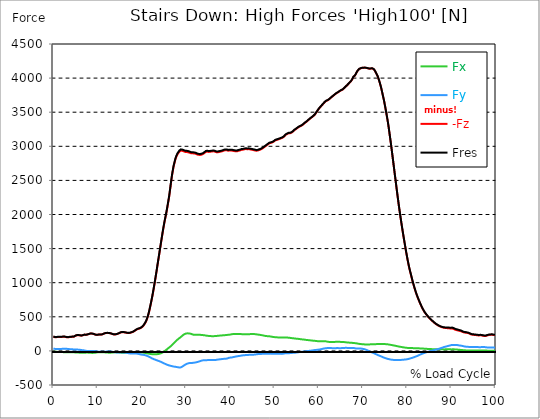
| Category |  Fx |  Fy |  -Fz |  Fres |
|---|---|---|---|---|
| 0.0 | -12.332 | 30.818 | 209.785 | 212.545 |
| 0.167348456675344 | -12.777 | 31.087 | 205.289 | 208.156 |
| 0.334696913350688 | -12.817 | 29.929 | 200.738 | 203.498 |
| 0.5020453700260321 | -12.723 | 28.004 | 198.544 | 201.075 |
| 0.669393826701376 | -13.45 | 27.654 | 201.411 | 203.929 |
| 0.83674228337672 | -14.083 | 27.627 | 203.256 | 205.8 |
| 1.0040907400520642 | -14.567 | 28.084 | 203.687 | 206.312 |
| 1.1621420602454444 | -15.092 | 28.636 | 203.915 | 206.635 |
| 1.3294905169207885 | -15.564 | 29.054 | 203.767 | 206.554 |
| 1.4968389735961325 | -15.981 | 29.296 | 203.444 | 206.285 |
| 1.6641874302714765 | -16.318 | 29.242 | 203.579 | 206.393 |
| 1.8315358869468206 | -16.748 | 29.485 | 204.629 | 207.47 |
| 1.9988843436221646 | -17.247 | 29.889 | 205.975 | 208.897 |
| 2.1662328002975086 | -17.947 | 30.737 | 206.864 | 209.96 |
| 2.333581256972853 | -18.822 | 31.558 | 207.254 | 210.553 |
| 2.5009297136481967 | -19.549 | 32.097 | 206.487 | 209.96 |
| 2.6682781703235405 | -19.778 | 31.814 | 205.518 | 208.991 |
| 2.8356266269988843 | -19.858 | 31.383 | 202.852 | 206.325 |
| 3.002975083674229 | -19.899 | 30.925 | 199.836 | 203.31 |
| 3.1703235403495724 | -19.764 | 29.256 | 198.921 | 202.152 |
| 3.337671997024917 | -19.724 | 27.748 | 198.476 | 201.532 |
| 3.4957233172182973 | -19.966 | 26.536 | 200.994 | 203.902 |
| 3.663071773893641 | -20.262 | 25.971 | 203.175 | 206.029 |
| 3.8304202305689854 | -20.491 | 25.392 | 204.494 | 207.281 |
| 3.997768687244329 | -20.693 | 24.678 | 205.464 | 208.143 |
| 4.165117143919673 | -20.895 | 23.965 | 206.5 | 209.072 |
| 4.332465600595017 | -21.057 | 23.063 | 207.456 | 209.893 |
| 4.499814057270361 | -21.137 | 21.636 | 208.008 | 210.257 |
| 4.667162513945706 | -21.178 | 20.141 | 209.435 | 211.509 |
| 4.834510970621049 | -21.514 | 19.131 | 216.342 | 218.321 |
| 5.001859427296393 | -22.349 | 19.212 | 222.912 | 224.905 |
| 5.169207883971737 | -23.224 | 19.603 | 226.318 | 228.419 |
| 5.336556340647081 | -23.897 | 19.36 | 229.563 | 231.677 |
| 5.503904797322425 | -24.597 | 18.983 | 231.3 | 233.44 |
| 5.671253253997769 | -25.149 | 18.404 | 231.327 | 233.481 |
| 5.82930457419115 | -25.54 | 17.637 | 229.725 | 231.879 |
| 5.996653030866494 | -25.782 | 16.627 | 227.597 | 229.711 |
| 6.164001487541838 | -25.715 | 14.823 | 225.793 | 227.813 |
| 6.331349944217181 | -25.459 | 12.669 | 223.572 | 225.443 |
| 6.498698400892526 | -25.392 | 10.811 | 225.861 | 227.624 |
| 6.66604685756787 | -25.378 | 9.02 | 229.119 | 230.802 |
| 6.833395314243213 | -25.634 | 7.714 | 233.063 | 234.693 |
| 7.000743770918558 | -26.375 | 7.257 | 237.399 | 239.055 |
| 7.168092227593902 | -26.159 | 5.116 | 236.564 | 238.139 |
| 7.335440684269246 | -25.513 | 2.087 | 235.743 | 237.197 |
| 7.50278914094459 | -24.961 | -0.579 | 236.093 | 237.453 |
| 7.6701375976199335 | -24.867 | -1.858 | 239.916 | 241.249 |
| 7.837486054295278 | -25.553 | -1.441 | 244.48 | 245.867 |
| 7.995537374488658 | -26.24 | -1.091 | 246.473 | 247.914 |
| 8.162885831164003 | -27.048 | -0.687 | 249.448 | 250.956 |
| 8.330234287839346 | -27.883 | -0.337 | 253.635 | 255.211 |
| 8.49758274451469 | -28.556 | -0.202 | 254.255 | 255.884 |
| 8.664931201190035 | -29.202 | 0.148 | 254.201 | 255.897 |
| 8.832279657865378 | -29.35 | -0.04 | 252.612 | 254.349 |
| 8.999628114540721 | -29.148 | -0.458 | 250.027 | 251.764 |
| 9.166976571216066 | -28.663 | -1.05 | 246.554 | 248.264 |
| 9.334325027891412 | -27.452 | -2.37 | 242.205 | 243.834 |
| 9.501673484566755 | -25.769 | -4.295 | 237.829 | 239.337 |
| 9.669021941242098 | -24.072 | -6.503 | 234.908 | 236.335 |
| 9.836370397917442 | -22.349 | -8.441 | 233.979 | 235.312 |
| 10.003718854592787 | -20.922 | -9.936 | 235.164 | 236.416 |
| 10.17106731126813 | -19.899 | -11.094 | 236.901 | 238.099 |
| 10.329118631461512 | -19.63 | -11.35 | 240.563 | 241.72 |
| 10.496467088136853 | -20.303 | -10.246 | 241.922 | 243.094 |
| 10.663815544812199 | -20.208 | -10.73 | 240.589 | 241.788 |
| 10.831164001487544 | -19.616 | -12.4 | 239.351 | 240.589 |
| 10.998512458162887 | -19.347 | -13.383 | 241.128 | 242.407 |
| 11.16586091483823 | -19.454 | -13.692 | 245.234 | 246.513 |
| 11.333209371513574 | -20.06 | -13.275 | 250.31 | 251.576 |
| 11.50055782818892 | -20.734 | -12.831 | 255.009 | 256.274 |
| 11.667906284864264 | -21.837 | -11.875 | 259.25 | 260.542 |
| 11.835254741539607 | -22.928 | -10.986 | 261.956 | 263.275 |
| 12.00260319821495 | -23.87 | -10.34 | 262.871 | 264.245 |
| 12.169951654890292 | -24.746 | -9.815 | 263.571 | 264.998 |
| 12.337300111565641 | -25.298 | -9.653 | 262.952 | 264.42 |
| 12.504648568240984 | -25.607 | -9.734 | 261.686 | 263.208 |
| 12.662699888434362 | -25.876 | -9.747 | 260.556 | 262.104 |
| 12.830048345109708 | -26.105 | -9.774 | 259.384 | 260.946 |
| 12.997396801785053 | -25.634 | -10.555 | 256.692 | 258.253 |
| 13.164745258460396 | -24.934 | -11.74 | 252.397 | 253.985 |
| 13.33209371513574 | -23.965 | -13.49 | 247.523 | 249.152 |
| 13.499442171811083 | -22.686 | -15.591 | 244.023 | 245.706 |
| 13.666790628486426 | -21.326 | -17.435 | 241.72 | 243.444 |
| 13.834139085161771 | -20.235 | -19.064 | 240.657 | 242.42 |
| 14.001487541837117 | -19.656 | -20.478 | 241.653 | 243.457 |
| 14.16883599851246 | -19.306 | -21.716 | 243.309 | 245.167 |
| 14.336184455187803 | -19.401 | -22.47 | 245.934 | 247.833 |
| 14.503532911863147 | -19.831 | -22.928 | 249.448 | 251.387 |
| 14.670881368538492 | -20.572 | -22.968 | 253.864 | 255.816 |
| 14.828932688731873 | -21.514 | -22.632 | 259.223 | 261.175 |
| 14.996281145407215 | -22.874 | -22.147 | 264.46 | 266.439 |
| 15.163629602082558 | -24.396 | -21.73 | 269.643 | 271.663 |
| 15.330978058757903 | -25.5 | -21.514 | 273.198 | 275.271 |
| 15.498326515433247 | -26.442 | -21.582 | 274.396 | 276.55 |
| 15.665674972108594 | -26.725 | -21.824 | 274.073 | 276.294 |
| 15.833023428783937 | -26.711 | -22.295 | 274.059 | 276.308 |
| 16.00037188545928 | -26.563 | -22.982 | 273.076 | 275.365 |
| 16.167720342134626 | -25.998 | -24.194 | 271.111 | 273.48 |
| 16.335068798809967 | -25.149 | -25.728 | 268.836 | 271.313 |
| 16.502417255485312 | -23.911 | -27.667 | 266.264 | 268.849 |
| 16.669765712160658 | -22.43 | -29.821 | 263.787 | 266.52 |
| 16.837114168836 | -20.787 | -31.975 | 261.74 | 264.635 |
| 17.004462625511344 | -19.064 | -34.076 | 260.798 | 263.868 |
| 17.16251394570472 | -17.637 | -35.947 | 261.915 | 265.12 |
| 17.32986240238007 | -16.546 | -37.455 | 264.393 | 267.705 |
| 17.497210859055414 | -16.008 | -38.344 | 267.907 | 271.286 |
| 17.664559315730756 | -15.537 | -39.165 | 271.03 | 274.436 |
| 17.8319077724061 | -16.318 | -38.734 | 273.871 | 277.264 |
| 17.999256229081443 | -17.004 | -38.465 | 278.179 | 281.518 |
| 18.166604685756788 | -17.893 | -38.101 | 284.668 | 287.953 |
| 18.333953142432133 | -19.212 | -37.845 | 292.719 | 295.951 |
| 18.501301599107478 | -20.734 | -37.913 | 300.111 | 303.369 |
| 18.668650055782823 | -22.241 | -38.478 | 306.223 | 309.589 |
| 18.835998512458165 | -23.561 | -39.542 | 312.807 | 316.321 |
| 19.00334696913351 | -24.786 | -41.184 | 319.969 | 323.685 |
| 19.170695425808855 | -25.163 | -42.854 | 323.281 | 327.186 |
| 19.338043882484197 | -24.692 | -45.412 | 325.718 | 329.878 |
| 19.496095202677576 | -23.87 | -48.387 | 328.518 | 333.002 |
| 19.66344365935292 | -22.847 | -51.255 | 331.736 | 336.543 |
| 19.830792116028263 | -22.255 | -53.786 | 336.664 | 341.78 |
| 19.998140572703612 | -23.292 | -55.603 | 346.896 | 352.2 |
| 20.165489029378953 | -23.965 | -57.004 | 356.562 | 361.988 |
| 20.3328374860543 | -25.203 | -57.704 | 366.593 | 372.059 |
| 20.500185942729644 | -26.738 | -59.266 | 380.406 | 386.02 |
| 20.667534399404985 | -28.623 | -61.904 | 399.039 | 404.909 |
| 20.83488285608033 | -30.602 | -63.924 | 415.976 | 422.048 |
| 21.002231312755672 | -32.743 | -67.545 | 439.2 | 445.649 |
| 21.16957976943102 | -34.964 | -72.083 | 466.854 | 473.774 |
| 21.336928226106362 | -37.334 | -77.037 | 499.341 | 506.719 |
| 21.504276682781704 | -39.73 | -82.18 | 535.45 | 543.258 |
| 21.67162513945705 | -41.844 | -87.633 | 579.259 | 587.431 |
| 21.82967645965043 | -43.89 | -93.18 | 627.727 | 636.209 |
| 21.997024916325774 | -45.721 | -98.659 | 677.797 | 686.548 |
| 22.16437337300112 | -47.243 | -104.354 | 729.793 | 738.813 |
| 22.33172182967646 | -48.414 | -110.063 | 783.834 | 793.111 |
| 22.499070286351806 | -49.383 | -115.111 | 841.848 | 851.232 |
| 22.666418743027148 | -50.191 | -119.635 | 902.581 | 911.978 |
| 22.833767199702496 | -50.743 | -123.916 | 966.006 | 975.363 |
| 23.00111565637784 | -50.487 | -128.09 | 1030.698 | 1039.974 |
| 23.168464113053183 | -49.33 | -132.142 | 1097.691 | 1106.86 |
| 23.335812569728528 | -48.67 | -136.155 | 1165.142 | 1174.217 |
| 23.50316102640387 | -47.741 | -140.517 | 1237.252 | 1246.272 |
| 23.670509483079215 | -46.246 | -144.502 | 1306.063 | 1314.989 |
| 23.83785793975456 | -44.321 | -148.245 | 1374.362 | 1383.194 |
| 23.995909259947936 | -41.898 | -152.001 | 1442.594 | 1451.292 |
| 24.163257716623285 | -38.505 | -156.363 | 1511.823 | 1520.507 |
| 24.330606173298627 | -34.803 | -160.994 | 1581.684 | 1590.368 |
| 24.49795462997397 | -30.01 | -166.057 | 1649.499 | 1658.236 |
| 24.665303086649313 | -24.221 | -171.482 | 1716.909 | 1725.755 |
| 24.83265154332466 | -18.081 | -176.975 | 1783.459 | 1792.425 |
| 25.0 | -10.825 | -181.876 | 1843.438 | 1852.552 |
| 25.167348456675345 | -2.975 | -187.032 | 1902.757 | 1912.087 |
| 25.334696913350694 | 5.493 | -192.041 | 1954.375 | 1963.934 |
| 25.502045370026035 | 14.258 | -196.928 | 2007.852 | 2017.64 |
| 25.669393826701377 | 23.359 | -201.438 | 2065.757 | 2075.774 |
| 25.836742283376722 | 32.406 | -205.666 | 2127.904 | 2138.163 |
| 26.004090740052067 | 41.104 | -209.233 | 2191.761 | 2202.208 |
| 26.17143919672741 | 49.612 | -212.397 | 2255.671 | 2266.28 |
| 26.329490516920792 | 57.435 | -216.1 | 2333.274 | 2344.071 |
| 26.49683897359613 | 65.957 | -219.587 | 2415.683 | 2426.615 |
| 26.66418743027148 | 75.206 | -221.606 | 2497.89 | 2508.929 |
| 26.831535886946828 | 85.559 | -223.841 | 2573.85 | 2585.105 |
| 26.998884343622166 | 97.138 | -226.83 | 2636.117 | 2647.75 |
| 27.166232800297514 | 108.218 | -228.93 | 2696.972 | 2708.954 |
| 27.333581256972852 | 119.433 | -230.573 | 2742.653 | 2755.052 |
| 27.5009297136482 | 130.433 | -232.188 | 2785.614 | 2798.445 |
| 27.668278170323543 | 141.109 | -233.912 | 2822.315 | 2835.617 |
| 27.835626626998888 | 151.341 | -235.931 | 2850.561 | 2864.442 |
| 28.002975083674233 | 161.614 | -237.762 | 2874.418 | 2888.891 |
| 28.170323540349575 | 171.752 | -239.768 | 2892.526 | 2907.646 |
| 28.33767199702492 | 179.897 | -241.868 | 2906.919 | 2922.63 |
| 28.50502045370026 | 187.329 | -243.578 | 2922.428 | 2938.638 |
| 28.663071773893645 | 195.582 | -243.861 | 2933.643 | 2950.351 |
| 28.830420230568986 | 204.791 | -241.29 | 2937.669 | 2954.767 |
| 28.99776868724433 | 213.892 | -236.147 | 2938.504 | 2955.858 |
| 29.165117143919673 | 223.68 | -229.2 | 2933.818 | 2951.374 |
| 29.33246560059502 | 232.31 | -222.266 | 2929.672 | 2947.403 |
| 29.499814057270367 | 240.239 | -214.834 | 2925.915 | 2943.754 |
| 29.66716251394571 | 246.567 | -207.55 | 2922.348 | 2940.213 |
| 29.834510970621054 | 251.724 | -201.169 | 2917.07 | 2934.976 |
| 30.00185942729639 | 254.78 | -195.326 | 2916.895 | 2934.68 |
| 30.169207883971744 | 256.772 | -189.658 | 2916.585 | 2934.195 |
| 30.33655634064708 | 257.553 | -185.74 | 2916.397 | 2933.818 |
| 30.50390479732243 | 257.405 | -182.657 | 2912.102 | 2929.348 |
| 30.671253253997772 | 256.22 | -179.803 | 2910.056 | 2927.033 |
| 30.829304574191156 | 254.78 | -177.406 | 2905.128 | 2921.863 |
| 30.996653030866494 | 252.531 | -176.639 | 2899.756 | 2916.262 |
| 31.164001487541842 | 249.327 | -176.639 | 2896.861 | 2913.098 |
| 31.331349944217187 | 245.154 | -176.127 | 2896.283 | 2912.129 |
| 31.498698400892525 | 240.751 | -175.966 | 2897.171 | 2912.64 |
| 31.666046857567874 | 237.735 | -174.983 | 2897.589 | 2912.748 |
| 31.833395314243212 | 236.402 | -173.179 | 2895.152 | 2910.123 |
| 32.00074377091856 | 235.729 | -170.876 | 2895.259 | 2910.056 |
| 32.1680922275939 | 235.298 | -168.695 | 2891.059 | 2905.734 |
| 32.33544068426925 | 236.51 | -166.42 | 2885.323 | 2899.972 |
| 32.50278914094459 | 237.089 | -163.875 | 2880.234 | 2894.815 |
| 32.670137597619934 | 237.197 | -161.021 | 2876.343 | 2890.803 |
| 32.83748605429528 | 236.766 | -157.669 | 2874.849 | 2889.12 |
| 33.004834510970625 | 236.335 | -154.33 | 2873.355 | 2887.437 |
| 33.162885831164004 | 235.568 | -150.453 | 2873.435 | 2887.303 |
| 33.33023428783935 | 234.773 | -146.414 | 2875.253 | 2888.864 |
| 33.497582744514695 | 233.925 | -142.765 | 2877.797 | 2891.22 |
| 33.664931201190036 | 233.05 | -139.453 | 2880.961 | 2894.196 |
| 33.83227965786538 | 231.879 | -138.161 | 2887.154 | 2900.241 |
| 33.99962811454073 | 230.128 | -137.757 | 2893.59 | 2906.515 |
| 34.16697657121607 | 228.661 | -137.339 | 2902.462 | 2915.225 |
| 34.33432502789141 | 227.207 | -136.922 | 2911.348 | 2923.95 |
| 34.50167348456676 | 225.632 | -136.774 | 2919.682 | 2932.122 |
| 34.6690219412421 | 223.249 | -136.047 | 2924.165 | 2936.376 |
| 34.83637039791744 | 221.189 | -135.764 | 2922.59 | 2934.64 |
| 35.00371885459279 | 220.3 | -134.256 | 2918.376 | 2930.318 |
| 35.17106731126814 | 219.412 | -133.341 | 2917.366 | 2929.187 |
| 35.338415767943474 | 218.604 | -132.816 | 2917.743 | 2929.483 |
| 35.49646708813686 | 217.621 | -133.152 | 2920.772 | 2932.432 |
| 35.6638155448122 | 216.665 | -133.731 | 2922.684 | 2934.29 |
| 35.831164001487544 | 215.804 | -134.229 | 2923.842 | 2935.407 |
| 35.998512458162885 | 215.373 | -134.512 | 2925.7 | 2937.238 |
| 36.165860914838234 | 215.75 | -134.768 | 2926.925 | 2938.49 |
| 36.333209371513576 | 216.275 | -134.835 | 2926.44 | 2938.046 |
| 36.50055782818892 | 217.123 | -134.633 | 2922.873 | 2934.545 |
| 36.667906284864266 | 218.079 | -133.825 | 2917.676 | 2929.402 |
| 36.83525474153961 | 219.021 | -131.389 | 2914.027 | 2925.7 |
| 37.002603198214956 | 220.112 | -129.086 | 2912.439 | 2924.044 |
| 37.1699516548903 | 221.445 | -127.673 | 2912.802 | 2924.407 |
| 37.337300111565646 | 222.602 | -125.909 | 2915.764 | 2927.329 |
| 37.50464856824098 | 223.585 | -124.67 | 2917.097 | 2928.648 |
| 37.66269988843437 | 224.528 | -123.297 | 2919.211 | 2930.735 |
| 37.83004834510971 | 225.47 | -121.856 | 2921.661 | 2933.159 |
| 37.99739680178505 | 226.44 | -120.402 | 2924.421 | 2935.892 |
| 38.16474525846039 | 227.422 | -118.935 | 2927.396 | 2938.84 |
| 38.33209371513574 | 228.244 | -117.575 | 2931.233 | 2942.65 |
| 38.49944217181109 | 228.863 | -116.471 | 2936.282 | 2947.672 |
| 38.666790628486424 | 229.967 | -115.933 | 2939.621 | 2951.065 |
| 38.83413908516178 | 231.286 | -115.502 | 2942.26 | 2953.784 |
| 39.001487541837115 | 232.363 | -114.613 | 2945.006 | 2956.571 |
| 39.16883599851246 | 233.669 | -112.85 | 2942.933 | 2954.552 |
| 39.336184455187805 | 234.706 | -110.601 | 2937.534 | 2949.153 |
| 39.503532911863154 | 235.958 | -106.387 | 2935.232 | 2946.837 |
| 39.670881368538495 | 236.658 | -101.917 | 2938.369 | 2949.893 |
| 39.83822982521384 | 237.708 | -99.305 | 2938.934 | 2950.486 |
| 39.996281145407224 | 239.526 | -98.161 | 2938.18 | 2949.867 |
| 40.163629602082565 | 241.922 | -97.246 | 2937.453 | 2949.328 |
| 40.33097805875791 | 244.575 | -96.088 | 2936.874 | 2948.951 |
| 40.498326515433256 | 246.042 | -93.126 | 2935.649 | 2947.78 |
| 40.6656749721086 | 247.119 | -90.891 | 2934.343 | 2946.514 |
| 40.83302342878393 | 248.062 | -88.871 | 2930.951 | 2943.148 |
| 41.00037188545929 | 248.25 | -86.461 | 2928.77 | 2940.913 |
| 41.16772034213463 | 248.614 | -83.944 | 2927.517 | 2939.634 |
| 41.33506879880997 | 249.004 | -81.399 | 2926.387 | 2938.477 |
| 41.50241725548531 | 249.193 | -79.164 | 2925.848 | 2937.911 |
| 41.66976571216066 | 249.233 | -77.428 | 2928.271 | 2940.281 |
| 41.837114168836 | 249.502 | -76.714 | 2934.411 | 2946.38 |
| 42.004462625511344 | 249.139 | -74.708 | 2937.44 | 2949.301 |
| 42.17181108218669 | 248.035 | -72.54 | 2938.53 | 2950.23 |
| 42.32986240238007 | 247.348 | -70.925 | 2943.35 | 2954.902 |
| 42.497210859055414 | 246.54 | -69.215 | 2947.537 | 2958.941 |
| 42.66455931573076 | 245.086 | -67.007 | 2948.574 | 2959.802 |
| 42.831907772406105 | 243.996 | -65.122 | 2950.392 | 2961.485 |
| 42.999256229081446 | 243.511 | -63.83 | 2953.246 | 2964.259 |
| 43.16660468575679 | 243.08 | -62.928 | 2955.777 | 2966.723 |
| 43.33395314243214 | 242.636 | -62.093 | 2958.456 | 2969.348 |
| 43.50130159910748 | 242.838 | -61.702 | 2959.991 | 2970.896 |
| 43.66865005578282 | 243.309 | -60.571 | 2958.874 | 2969.806 |
| 43.83599851245817 | 243.646 | -60.087 | 2957.527 | 2968.486 |
| 44.00334696913351 | 244.13 | -59.508 | 2958.079 | 2969.079 |
| 44.17069542580886 | 244.386 | -58.229 | 2958.954 | 2969.954 |
| 44.3380438824842 | 245.073 | -57.004 | 2958.281 | 2969.321 |
| 44.49609520267758 | 246.594 | -56.681 | 2954.377 | 2965.565 |
| 44.66344365935292 | 247.388 | -56.061 | 2950.082 | 2961.337 |
| 44.83079211602827 | 247.402 | -54.782 | 2950.647 | 2961.916 |
| 44.99814057270361 | 247.792 | -54.89 | 2949.166 | 2960.503 |
| 45.16548902937895 | 247.927 | -54.957 | 2945.572 | 2956.948 |
| 45.332837486054295 | 247.362 | -54.863 | 2942.906 | 2954.256 |
| 45.500185942729644 | 246.083 | -53.463 | 2940.685 | 2951.9 |
| 45.66753439940499 | 244.777 | -52.224 | 2938.315 | 2949.409 |
| 45.83488285608033 | 243.457 | -51.147 | 2935.892 | 2946.864 |
| 46.00223131275568 | 241.882 | -49.505 | 2935.663 | 2946.487 |
| 46.16957976943102 | 240.293 | -47.674 | 2936.874 | 2947.537 |
| 46.336928226106366 | 238.772 | -45.762 | 2940.873 | 2951.401 |
| 46.50427668278171 | 237.251 | -44.954 | 2944.697 | 2955.104 |
| 46.671625139457056 | 235.77 | -44.604 | 2948.345 | 2958.658 |
| 46.829676459650436 | 233.979 | -44.24 | 2951.846 | 2962.01 |
| 46.99702491632577 | 232.108 | -43.904 | 2957.218 | 2967.221 |
| 47.16437337300112 | 230.048 | -43.5 | 2964.003 | 2973.831 |
| 47.33172182967646 | 227.799 | -43.056 | 2970.869 | 2980.509 |
| 47.49907028635181 | 225.255 | -43.056 | 2978.261 | 2987.712 |
| 47.66641874302716 | 222.602 | -42.746 | 2987.577 | 2996.827 |
| 47.83376719970249 | 220.475 | -42.221 | 2995.669 | 3004.757 |
| 48.001115656377834 | 218.967 | -41.709 | 3003.531 | 3012.471 |
| 48.16846411305319 | 217.742 | -41.48 | 3011.434 | 3020.253 |
| 48.33581256972853 | 216.477 | -41.198 | 3019.795 | 3028.479 |
| 48.50316102640387 | 215.548 | -40.982 | 3028.708 | 3037.27 |
| 48.67050948307921 | 214.78 | -40.632 | 3036.638 | 3045.093 |
| 48.837857939754564 | 214.094 | -40.134 | 3043.854 | 3052.201 |
| 49.005206396429905 | 212.653 | -39.851 | 3049.307 | 3057.519 |
| 49.163257716623285 | 210.93 | -40.309 | 3050.316 | 3058.421 |
| 49.33060617329863 | 208.681 | -41.09 | 3052.996 | 3060.966 |
| 49.49795462997397 | 206.514 | -41.871 | 3056.711 | 3064.547 |
| 49.66530308664932 | 204.467 | -42.652 | 3061.841 | 3069.555 |
| 49.832651543324666 | 203.067 | -42.854 | 3069.192 | 3076.812 |
| 50.0 | 201.95 | -42.679 | 3078.024 | 3085.55 |
| 50.16734845667534 | 200.859 | -42.49 | 3086.735 | 3094.166 |
| 50.33469691335069 | 199.944 | -42.948 | 3090.451 | 3097.842 |
| 50.50204537002604 | 199.028 | -43.419 | 3094.18 | 3101.531 |
| 50.66939382670139 | 198.369 | -43.594 | 3097.465 | 3104.775 |
| 50.836742283376715 | 197.817 | -43.5 | 3100.938 | 3108.222 |
| 51.00409074005207 | 197.197 | -43.379 | 3104.924 | 3112.14 |
| 51.17143919672741 | 196.995 | -43.217 | 3108.895 | 3116.098 |
| 51.32949051692079 | 197.13 | -43.271 | 3113.298 | 3120.501 |
| 51.496838973596134 | 197.44 | -43.473 | 3117.848 | 3125.051 |
| 51.66418743027148 | 198.14 | -43.688 | 3120.972 | 3128.229 |
| 51.831535886946824 | 198.49 | -42.988 | 3126.29 | 3133.533 |
| 51.99888434362217 | 198.072 | -40.403 | 3134.395 | 3141.584 |
| 52.16623280029752 | 197.211 | -38.142 | 3142.257 | 3149.366 |
| 52.33358125697285 | 196.295 | -35.435 | 3155.64 | 3162.668 |
| 52.5009297136482 | 195.582 | -33.497 | 3167.097 | 3174.085 |
| 52.668278170323546 | 195.501 | -33.376 | 3173.236 | 3180.21 |
| 52.835626626998895 | 195.487 | -33.376 | 3179.47 | 3186.444 |
| 53.00297508367424 | 194.787 | -33.335 | 3185.784 | 3192.718 |
| 53.17032354034958 | 193.979 | -33.335 | 3190.887 | 3197.767 |
| 53.33767199702492 | 192.741 | -33.295 | 3190.416 | 3197.228 |
| 53.50502045370027 | 191.395 | -32.447 | 3191.493 | 3198.211 |
| 53.663071773893655 | 189.712 | -31.114 | 3195.37 | 3201.967 |
| 53.83042023056899 | 187.679 | -30.319 | 3200.338 | 3206.814 |
| 53.99776868724433 | 186.211 | -29.162 | 3207.851 | 3214.246 |
| 54.16511714391967 | 184.811 | -27.829 | 3215.148 | 3221.462 |
| 54.33246560059503 | 183.949 | -27.856 | 3228.786 | 3235.073 |
| 54.49981405727037 | 183.101 | -27.384 | 3237.645 | 3243.865 |
| 54.667162513945705 | 181.889 | -26.321 | 3243.946 | 3250.058 |
| 54.834510970621054 | 179.803 | -24.409 | 3251.687 | 3257.625 |
| 55.0018594272964 | 177.891 | -23.184 | 3261.677 | 3267.493 |
| 55.169207883971744 | 177.514 | -21.649 | 3268.341 | 3274.117 |
| 55.336556340647086 | 176.935 | -20.357 | 3276.177 | 3281.899 |
| 55.50390479732243 | 175.467 | -18.687 | 3283.595 | 3289.196 |
| 55.671253253997776 | 174.04 | -17.273 | 3289.6 | 3295.079 |
| 55.83860171067312 | 172.411 | -16.25 | 3294.985 | 3300.344 |
| 55.9966530308665 | 170.23 | -14.81 | 3300.438 | 3305.729 |
| 56.16400148754184 | 168.803 | -13.006 | 3305.85 | 3311.074 |
| 56.33134994421718 | 168.238 | -11.282 | 3312.339 | 3317.523 |
| 56.498698400892536 | 167.322 | -10.326 | 3321.171 | 3326.287 |
| 56.66604685756788 | 166.272 | -9.68 | 3330.986 | 3336.021 |
| 56.83339531424321 | 164.751 | -8.617 | 3341.703 | 3346.657 |
| 57.00074377091856 | 162.718 | -7.149 | 3349.417 | 3354.291 |
| 57.16809222759391 | 160.9 | -5.587 | 3356.741 | 3361.534 |
| 57.33544068426925 | 159.635 | -3.837 | 3365.425 | 3370.178 |
| 57.5027891409446 | 158.665 | -1.979 | 3375.415 | 3380.141 |
| 57.670137597619934 | 157.696 | -0.525 | 3385.499 | 3390.184 |
| 57.83748605429528 | 157.05 | 0.458 | 3394.304 | 3398.976 |
| 58.004834510970625 | 155.946 | 1.212 | 3404.025 | 3408.629 |
| 58.16288583116401 | 153.98 | 2.45 | 3413.059 | 3417.569 |
| 58.330234287839346 | 152.109 | 3.783 | 3421.325 | 3425.768 |
| 58.497582744514695 | 150.843 | 5.506 | 3428.353 | 3432.742 |
| 58.66493120119004 | 150.426 | 7.62 | 3436.027 | 3440.403 |
| 58.832279657865385 | 149.833 | 9.99 | 3446.771 | 3451.146 |
| 58.999628114540734 | 148.797 | 11.175 | 3456.599 | 3460.948 |
| 59.16697657121607 | 147.396 | 12.305 | 3468.231 | 3472.513 |
| 59.33432502789142 | 146.01 | 13.881 | 3484.778 | 3489.005 |
| 59.50167348456676 | 144.596 | 15.294 | 3501.095 | 3505.255 |
| 59.66902194124211 | 143.263 | 16.398 | 3516.443 | 3520.55 |
| 59.83637039791745 | 142.051 | 17.664 | 3532.115 | 3536.194 |
| 60.00371885459278 | 140.826 | 18.916 | 3547.799 | 3551.852 |
| 60.17106731126813 | 140.342 | 20.653 | 3562.461 | 3566.5 |
| 60.33841576794349 | 139.763 | 22.43 | 3573.151 | 3577.163 |
| 60.49646708813685 | 140.14 | 24.786 | 3585.726 | 3589.738 |
| 60.6638155448122 | 140.651 | 27.452 | 3597.654 | 3601.693 |
| 60.831164001487544 | 141.096 | 30.144 | 3609.529 | 3613.595 |
| 60.99851245816289 | 141.405 | 32.702 | 3621.605 | 3625.698 |
| 61.16586091483824 | 141.419 | 34.937 | 3634.113 | 3638.219 |
| 61.333209371513576 | 141.136 | 36.768 | 3646.31 | 3650.403 |
| 61.50055782818892 | 140.355 | 38.047 | 3656.475 | 3660.514 |
| 61.667906284864266 | 139.534 | 39.246 | 3665.348 | 3669.333 |
| 61.835254741539615 | 137.73 | 40.255 | 3670.787 | 3674.651 |
| 62.002603198214956 | 134.916 | 41.952 | 3673.937 | 3677.599 |
| 62.16995165489029 | 132.587 | 43.231 | 3678.946 | 3682.419 |
| 62.33730011156564 | 131.658 | 43.258 | 3688.397 | 3691.816 |
| 62.504648568240995 | 130.877 | 42.813 | 3699.693 | 3703.045 |
| 62.67199702491633 | 131.106 | 42.638 | 3707.946 | 3711.298 |
| 62.83004834510971 | 131.752 | 41.857 | 3716.293 | 3719.645 |
| 62.99739680178505 | 132.116 | 40.201 | 3725.784 | 3729.11 |
| 63.1647452584604 | 132.641 | 39.044 | 3733.997 | 3737.323 |
| 63.33209371513575 | 132.25 | 38.572 | 3743.556 | 3746.828 |
| 63.4994421718111 | 131.981 | 38.855 | 3751.015 | 3754.232 |
| 63.666790628486424 | 131.887 | 39.017 | 3761.408 | 3764.599 |
| 63.83413908516177 | 132.654 | 39.932 | 3769.863 | 3773.068 |
| 64.00148754183712 | 133.947 | 40.673 | 3778.17 | 3781.428 |
| 64.16883599851248 | 134.647 | 41.279 | 3784.188 | 3787.446 |
| 64.3361844551878 | 134.727 | 41.292 | 3790.301 | 3793.559 |
| 64.50353291186315 | 133.583 | 39.811 | 3798.338 | 3801.543 |
| 64.6708813685385 | 133.166 | 39.73 | 3805.407 | 3808.597 |
| 64.83822982521384 | 132.775 | 39.784 | 3812.407 | 3815.585 |
| 65.00557828188919 | 131.887 | 39.461 | 3819.503 | 3822.64 |
| 65.16362960208257 | 131.739 | 40.996 | 3823.245 | 3826.342 |
| 65.3309780587579 | 131.55 | 42.504 | 3829.062 | 3832.131 |
| 65.49832651543326 | 130.635 | 42.517 | 3837.557 | 3840.573 |
| 65.6656749721086 | 130.083 | 43.029 | 3847.089 | 3850.078 |
| 65.83302342878395 | 128.911 | 43.635 | 3856.217 | 3859.139 |
| 66.00037188545929 | 127.228 | 44.685 | 3869.142 | 3871.969 |
| 66.16772034213463 | 125.72 | 44.981 | 3880.438 | 3883.171 |
| 66.33506879880998 | 124.428 | 44.335 | 3889.66 | 3892.339 |
| 66.50241725548531 | 123.149 | 43.702 | 3899.811 | 3902.41 |
| 66.66976571216065 | 122.153 | 43.46 | 3911.699 | 3914.257 |
| 66.83711416883601 | 121.601 | 43.729 | 3923.17 | 3925.688 |
| 67.00446262551135 | 120.941 | 44.079 | 3934.964 | 3937.441 |
| 67.1718110821867 | 120.174 | 44.267 | 3948.495 | 3950.945 |
| 67.32986240238007 | 119.204 | 43.015 | 3958.525 | 3960.935 |
| 67.49721085905541 | 118.262 | 42.611 | 3974.869 | 3977.239 |
| 67.66455931573076 | 117.36 | 42.638 | 3994.216 | 3996.545 |
| 67.83190777240611 | 116.135 | 43.069 | 4018.517 | 4020.793 |
| 67.99925622908145 | 115.058 | 41.386 | 4032.492 | 4034.727 |
| 68.16660468575678 | 114.115 | 37.563 | 4035.912 | 4038.133 |
| 68.33395314243214 | 112.634 | 36.459 | 4053.185 | 4055.353 |
| 68.50130159910749 | 110.951 | 36.405 | 4075.642 | 4077.756 |
| 68.66865005578282 | 109.416 | 36.405 | 4095.231 | 4097.318 |
| 68.83599851245816 | 107.33 | 36.351 | 4110.741 | 4112.801 |
| 69.00334696913352 | 104.893 | 36.297 | 4123.235 | 4125.255 |
| 69.17069542580886 | 102.846 | 36.714 | 4134.585 | 4136.577 |
| 69.3380438824842 | 101.702 | 35.826 | 4140.737 | 4142.716 |
| 69.50539233915956 | 100.719 | 34.385 | 4143.807 | 4145.759 |
| 69.66344365935292 | 99.427 | 33.187 | 4147.173 | 4149.112 |
| 69.83079211602826 | 98.134 | 31.975 | 4150.552 | 4152.464 |
| 69.99814057270362 | 97.649 | 29.579 | 4150.458 | 4152.37 |
| 70.16548902937896 | 96.653 | 27.277 | 4151.575 | 4153.46 |
| 70.33283748605429 | 95.59 | 24.746 | 4152.262 | 4154.133 |
| 70.50018594272964 | 94.526 | 21.784 | 4151.966 | 4153.797 |
| 70.667534399405 | 93.503 | 17.933 | 4150.956 | 4152.774 |
| 70.83488285608033 | 92.803 | 13.329 | 4148.492 | 4150.269 |
| 71.00223131275568 | 92.533 | 8.482 | 4144.736 | 4146.513 |
| 71.16957976943102 | 94.055 | 3.245 | 4142.286 | 4144.076 |
| 71.33692822610637 | 94.836 | -2.235 | 4138.745 | 4140.549 |
| 71.50427668278171 | 95.24 | -7.849 | 4137.372 | 4139.189 |
| 71.67162513945706 | 95.926 | -13.302 | 4138.381 | 4140.199 |
| 71.8389735961324 | 95.832 | -17.623 | 4140.953 | 4142.757 |
| 71.99702491632577 | 96.142 | -21.487 | 4141.195 | 4142.999 |
| 72.16437337300113 | 96.505 | -25.338 | 4141.128 | 4142.918 |
| 72.33172182967647 | 97.192 | -29.606 | 4138.826 | 4140.63 |
| 72.49907028635181 | 97.811 | -34.466 | 4126.776 | 4128.607 |
| 72.66641874302715 | 98.148 | -39.38 | 4110.849 | 4112.707 |
| 72.8337671997025 | 98.686 | -44.483 | 4090.896 | 4092.794 |
| 73.00111565637783 | 99.265 | -49.76 | 4070.27 | 4072.236 |
| 73.16846411305319 | 100.046 | -54.998 | 4048.635 | 4050.668 |
| 73.33581256972853 | 101.029 | -59.844 | 4026.299 | 4028.426 |
| 73.50316102640387 | 101.419 | -64.435 | 3993.92 | 3996.128 |
| 73.67050948307921 | 101.231 | -68.676 | 3961.002 | 3963.277 |
| 73.83785793975457 | 101.123 | -73.038 | 3925.163 | 3927.519 |
| 74.00520639642991 | 100.894 | -77.414 | 3884.921 | 3887.371 |
| 74.16325771662328 | 101.123 | -82.099 | 3842.861 | 3845.419 |
| 74.33060617329863 | 101.096 | -86.852 | 3794.218 | 3796.898 |
| 74.49795462997398 | 100.934 | -91.645 | 3744.148 | 3746.949 |
| 74.66530308664932 | 101.015 | -96.37 | 3697.35 | 3700.298 |
| 74.83265154332466 | 100.45 | -100.571 | 3643.416 | 3646.486 |
| 75.00000000000001 | 99.75 | -104.489 | 3587.53 | 3590.734 |
| 75.16734845667534 | 99.05 | -108.03 | 3528.601 | 3531.926 |
| 75.3346969133507 | 98.067 | -111.53 | 3468.595 | 3472.041 |
| 75.50204537002605 | 96.922 | -114.707 | 3405.64 | 3409.221 |
| 75.66939382670138 | 95.684 | -118.073 | 3340.949 | 3344.651 |
| 75.83674228337672 | 93.987 | -120.739 | 3267.884 | 3271.694 |
| 76.00409074005208 | 91.941 | -123.014 | 3190.106 | 3194.037 |
| 76.17143919672742 | 89.746 | -125.195 | 3111.386 | 3115.438 |
| 76.33878765340276 | 87.727 | -127.323 | 3031.225 | 3035.399 |
| 76.49683897359614 | 85.707 | -129.356 | 2948.076 | 2952.371 |
| 76.66418743027148 | 83.499 | -130.756 | 2862.907 | 2867.31 |
| 76.83153588694682 | 81.318 | -131.739 | 2776.311 | 2780.835 |
| 76.99888434362218 | 79.528 | -132.358 | 2691.007 | 2695.639 |
| 77.16623280029752 | 77.656 | -132.883 | 2604.64 | 2609.379 |
| 77.33358125697285 | 75.273 | -133.193 | 2520.481 | 2525.314 |
| 77.5009297136482 | 72.917 | -133.435 | 2434.962 | 2439.903 |
| 77.66827817032356 | 70.346 | -133.839 | 2349.241 | 2354.29 |
| 77.83562662699889 | 67.869 | -134.148 | 2266.307 | 2271.477 |
| 78.00297508367423 | 65.58 | -134.579 | 2184.881 | 2190.199 |
| 78.17032354034959 | 63.574 | -134.647 | 2104.761 | 2110.213 |
| 78.33767199702493 | 61.702 | -134.041 | 2028.828 | 2034.388 |
| 78.50502045370027 | 59.548 | -133.139 | 1953.998 | 1959.626 |
| 78.67236891037561 | 57.542 | -132.035 | 1882.495 | 1888.203 |
| 78.83042023056899 | 55.496 | -130.971 | 1812.822 | 1818.611 |
| 78.99776868724433 | 53.624 | -129.867 | 1744.146 | 1750.002 |
| 79.16511714391969 | 51.793 | -128.804 | 1677.233 | 1683.17 |
| 79.33246560059503 | 50.11 | -127.74 | 1613.027 | 1619.058 |
| 79.49981405727036 | 48.562 | -126.798 | 1548.968 | 1555.107 |
| 79.66716251394571 | 47.068 | -125.747 | 1485.717 | 1491.964 |
| 79.83451097062107 | 45.668 | -124.334 | 1424.338 | 1430.679 |
| 80.00185942729641 | 44.483 | -122.489 | 1365.1 | 1371.508 |
| 80.16920788397174 | 43.715 | -120.12 | 1308.473 | 1314.922 |
| 80.33655634064709 | 43.244 | -117.319 | 1255.629 | 1262.078 |
| 80.50390479732243 | 42.921 | -114.263 | 1206.354 | 1212.762 |
| 80.67125325399778 | 42.706 | -110.938 | 1160.996 | 1167.323 |
| 80.83860171067312 | 42.248 | -107.505 | 1120.296 | 1126.489 |
| 80.99665303086651 | 41.696 | -104.26 | 1075.867 | 1081.979 |
| 81.16400148754184 | 41.09 | -100.934 | 1032.933 | 1038.924 |
| 81.3313499442172 | 40.592 | -97.515 | 993.902 | 999.759 |
| 81.49869840089255 | 40.336 | -93.516 | 955.411 | 961.065 |
| 81.66604685756786 | 40.148 | -89.383 | 918.683 | 924.149 |
| 81.83339531424322 | 39.811 | -85.304 | 883.49 | 888.754 |
| 82.00074377091858 | 39.394 | -81.157 | 849.737 | 854.773 |
| 82.16809222759392 | 38.815 | -77.172 | 819.539 | 824.359 |
| 82.33544068426926 | 38.33 | -72.769 | 790.849 | 795.413 |
| 82.50278914094459 | 38.007 | -67.801 | 762.858 | 767.14 |
| 82.67013759761994 | 37.603 | -62.968 | 736.565 | 740.59 |
| 82.83748605429528 | 37.011 | -58.067 | 711.105 | 714.929 |
| 83.00483451097062 | 36.055 | -52.292 | 686.023 | 689.793 |
| 83.17218296764597 | 35.503 | -47.781 | 662.287 | 665.896 |
| 83.33023428783935 | 35.018 | -43.487 | 639.198 | 642.779 |
| 83.4975827445147 | 34.372 | -38.963 | 617.697 | 621.332 |
| 83.66493120119004 | 33.645 | -34.924 | 597.906 | 601.541 |
| 83.83227965786537 | 32.824 | -30.589 | 579.057 | 582.692 |
| 83.99962811454073 | 32.043 | -26.59 | 561.878 | 565.554 |
| 84.16697657121607 | 31.343 | -23.224 | 546.638 | 550.327 |
| 84.33432502789142 | 30.508 | -19.926 | 532.326 | 536.069 |
| 84.50167348456677 | 29.754 | -16.816 | 518.742 | 522.498 |
| 84.6690219412421 | 28.987 | -13.786 | 506.207 | 510.031 |
| 84.83637039791745 | 28.327 | -10.663 | 493.552 | 497.443 |
| 85.0037188545928 | 27.721 | -7.566 | 481.354 | 485.366 |
| 85.17106731126813 | 27.115 | -4.604 | 470.179 | 474.205 |
| 85.33841576794349 | 26.63 | -1.643 | 459.059 | 463.044 |
| 85.50576422461883 | 26.105 | 1.131 | 449.029 | 452.987 |
| 85.66381554481221 | 25.607 | 3.689 | 440.277 | 444.222 |
| 85.83116400148755 | 25.378 | 6.637 | 430.261 | 434.165 |
| 85.99851245816289 | 25.149 | 9.734 | 420.581 | 424.458 |
| 86.16586091483823 | 24.948 | 12.992 | 411.452 | 415.33 |
| 86.33320937151358 | 24.894 | 16.506 | 402.082 | 405.946 |
| 86.50055782818893 | 24.571 | 19.131 | 394.219 | 398.124 |
| 86.66790628486427 | 24.194 | 21.097 | 386.909 | 390.827 |
| 86.83525474153961 | 23.911 | 23.399 | 379.894 | 383.826 |
| 87.00260319821496 | 23.709 | 26.684 | 373.378 | 377.484 |
| 87.16995165489031 | 23.547 | 30.144 | 367.374 | 371.709 |
| 87.33730011156564 | 23.372 | 33.874 | 361.625 | 366.216 |
| 87.504648568241 | 23.157 | 37.59 | 356.441 | 361.355 |
| 87.67199702491634 | 22.941 | 40.969 | 352.456 | 357.693 |
| 87.83004834510972 | 22.672 | 44.873 | 348.336 | 353.951 |
| 87.99739680178506 | 22.524 | 48.885 | 344.715 | 350.706 |
| 88.1647452584604 | 22.403 | 52.884 | 341.497 | 347.852 |
| 88.33209371513574 | 22.241 | 56.802 | 338.804 | 345.603 |
| 88.49944217181108 | 22.268 | 60.046 | 337.66 | 344.93 |
| 88.66679062848644 | 22.443 | 62.672 | 336.435 | 344.109 |
| 88.83413908516178 | 22.672 | 65.284 | 335.264 | 343.382 |
| 89.00148754183712 | 23.13 | 67.99 | 334.415 | 343.099 |
| 89.16883599851246 | 23.588 | 70.602 | 333.056 | 342.318 |
| 89.33618445518782 | 23.574 | 73.631 | 331.803 | 341.699 |
| 89.50353291186315 | 23.359 | 77.441 | 330.861 | 341.403 |
| 89.6708813685385 | 22.713 | 79.447 | 329.299 | 340.205 |
| 89.83822982521386 | 22.241 | 82.772 | 328.828 | 340.339 |
| 90.00557828188919 | 22.188 | 85.707 | 329.34 | 341.484 |
| 90.16362960208257 | 22.82 | 87.121 | 329.394 | 341.995 |
| 90.3309780587579 | 23.049 | 87.377 | 325.812 | 338.616 |
| 90.49832651543326 | 22.807 | 88.158 | 321.396 | 334.483 |
| 90.66567497210859 | 22.403 | 87.902 | 315.984 | 329.084 |
| 90.83302342878395 | 21.797 | 87.417 | 311.312 | 324.372 |
| 91.00037188545929 | 21.084 | 87.606 | 307.125 | 320.373 |
| 91.16772034213463 | 20.101 | 86.596 | 304.446 | 317.452 |
| 91.33506879880998 | 19.333 | 85.411 | 301.874 | 314.611 |
| 91.50241725548533 | 18.297 | 83.432 | 299.128 | 311.339 |
| 91.66976571216065 | 17.152 | 81.103 | 296.57 | 308.148 |
| 91.83711416883601 | 16.048 | 78.882 | 294.241 | 305.24 |
| 92.00446262551137 | 15.039 | 78.128 | 292.194 | 303.019 |
| 92.1718110821867 | 14.029 | 76.835 | 288.829 | 299.37 |
| 92.33915953886203 | 12.938 | 74.856 | 284.13 | 294.268 |
| 92.49721085905541 | 11.753 | 72.419 | 278.354 | 288.007 |
| 92.66455931573077 | 10.528 | 69.821 | 273.602 | 282.757 |
| 92.83190777240611 | 9.424 | 67.02 | 271.313 | 279.889 |
| 92.99925622908145 | 8.482 | 64.691 | 269.522 | 277.627 |
| 93.1666046857568 | 7.782 | 62.874 | 268.001 | 275.756 |
| 93.33395314243214 | 7.391 | 61.554 | 266.52 | 273.992 |
| 93.50130159910749 | 6.839 | 60.464 | 264.716 | 271.972 |
| 93.66865005578283 | 6.234 | 59.4 | 262.79 | 269.832 |
| 93.83599851245818 | 5.614 | 58.337 | 260.865 | 267.691 |
| 94.00334696913353 | 5.52 | 58.714 | 256.894 | 263.894 |
| 94.17069542580886 | 5.52 | 58.31 | 250.673 | 257.755 |
| 94.3380438824842 | 5.318 | 57.165 | 243.592 | 250.593 |
| 94.50539233915954 | 4.981 | 55.832 | 240.159 | 246.944 |
| 94.66344365935292 | 4.833 | 55.334 | 238.341 | 245.059 |
| 94.83079211602828 | 4.779 | 55.415 | 237.587 | 244.332 |
| 94.99814057270362 | 4.739 | 55.59 | 235.729 | 242.542 |
| 95.16548902937897 | 4.874 | 55.698 | 234.679 | 241.532 |
| 95.33283748605432 | 4.86 | 55.671 | 233.656 | 240.563 |
| 95.50018594272963 | 4.955 | 55.967 | 232.66 | 239.661 |
| 95.66753439940499 | 5.21 | 56.317 | 231.879 | 239.014 |
| 95.83488285608034 | 5.103 | 56.263 | 229.576 | 236.779 |
| 96.00223131275567 | 5.049 | 56.142 | 228.863 | 236.039 |
| 96.16957976943102 | 4.901 | 55.375 | 226.615 | 233.656 |
| 96.33692822610638 | 4.86 | 54.257 | 225.874 | 232.673 |
| 96.50427668278171 | 4.739 | 54.607 | 228.688 | 235.5 |
| 96.67162513945706 | 4.685 | 54.998 | 229.2 | 236.093 |
| 96.8389735961324 | 5.331 | 56.196 | 227.274 | 234.491 |
| 96.99702491632577 | 6.462 | 57.906 | 224.622 | 232.31 |
| 97.16437337300111 | 6.961 | 58.229 | 221.122 | 228.984 |
| 97.33172182967647 | 6.786 | 57.596 | 219.048 | 226.79 |
| 97.49907028635181 | 6.382 | 56.532 | 218.24 | 225.753 |
| 97.66641874302715 | 5.843 | 54.621 | 217.742 | 224.824 |
| 97.8337671997025 | 5.049 | 52.763 | 220.502 | 227.086 |
| 98.00111565637785 | 4.241 | 51.565 | 223.895 | 230.142 |
| 98.16846411305319 | 3.756 | 50.689 | 227.732 | 233.75 |
| 98.33581256972855 | 3.42 | 50.285 | 230.788 | 236.672 |
| 98.50316102640389 | 3.043 | 50.461 | 234.167 | 239.997 |
| 98.67050948307921 | 2.679 | 50.299 | 234.962 | 240.711 |
| 98.83785793975456 | 2.612 | 50.299 | 236.025 | 241.72 |
| 99.0052063964299 | 2.571 | 50.312 | 237.129 | 242.784 |
| 99.17255485310525 | 2.545 | 50.38 | 237.628 | 243.296 |
| 99.33060617329863 | 2.464 | 50.124 | 236.2 | 241.868 |
| 99.49795462997399 | 2.329 | 49.235 | 233.171 | 238.772 |
| 99.66530308664933 | 2.1 | 48.293 | 230.99 | 236.524 |
| 99.83265154332467 | 1.481 | 47.229 | 232.458 | 237.924 |
| 100.0 | 0.875 | 46.152 | 233.912 | 239.31 |